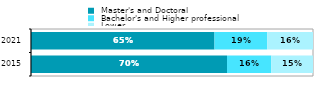
| Category |  Master's and Doctoral |  Bachelor's and Higher professional |  Lower |
|---|---|---|---|
| 2015.0 | 0.695 | 0.157 | 0.148 |
| 2021.0 | 0.651 | 0.187 | 0.163 |